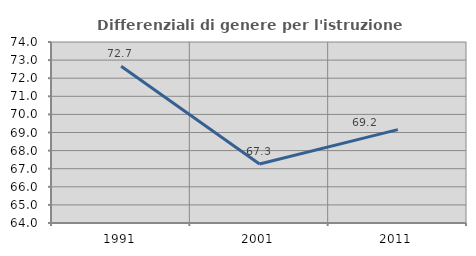
| Category | Differenziali di genere per l'istruzione superiore |
|---|---|
| 1991.0 | 72.662 |
| 2001.0 | 67.257 |
| 2011.0 | 69.159 |